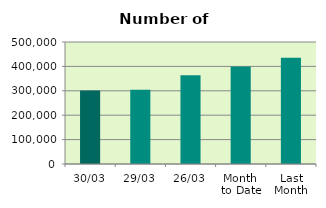
| Category | Series 0 |
|---|---|
| 30/03 | 301154 |
| 29/03 | 303888 |
| 26/03 | 363990 |
| Month 
to Date | 400019.818 |
| Last
Month | 435925.8 |